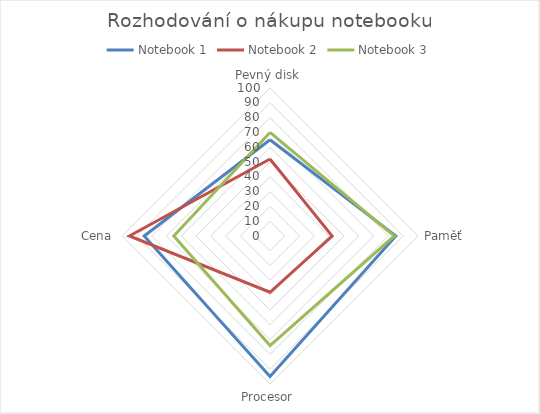
| Category | Notebook 1 | Notebook 2 | Notebook 3 |
|---|---|---|---|
| Pevný disk | 65 | 52 | 70 |
| Paměť | 85 | 42 | 84 |
| Procesor | 95 | 38 | 74 |
| Cena | 85 | 95 | 65 |